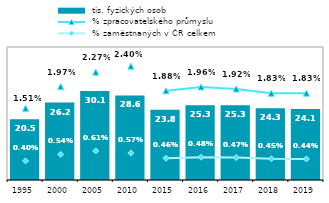
| Category |  tis. fyzických osob |
|---|---|
| 1995.0 | 20.519 |
| 2000.0 | 26.206 |
| 2005.0 | 30.105 |
| 2010.0 | 28.602 |
| 2015.0 | 23.771 |
| 2016.0 | 25.292 |
| 2017.0 | 25.298 |
| 2018.0 | 24.253 |
| 2019.0 | 24.054 |